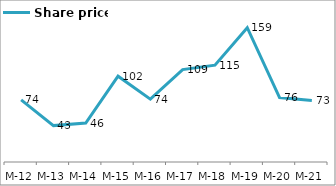
| Category | Share price |
|---|---|
| 2012-03-31 | 73.61 |
| 2013-03-31 | 43.1 |
| 2014-03-31 | 46.06 |
| 2015-03-31 | 101.61 |
| 2016-03-31 | 74.37 |
| 2017-03-31 | 109.42 |
| 2018-03-31 | 114.67 |
| 2019-03-31 | 159.05 |
| 2020-03-31 | 76.27 |
| 2021-03-31 | 72.95 |